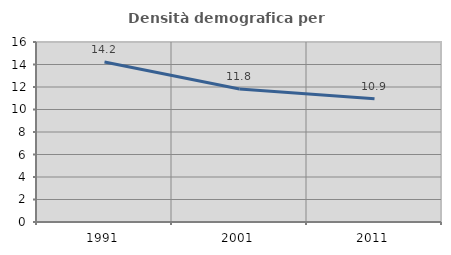
| Category | Densità demografica |
|---|---|
| 1991.0 | 14.224 |
| 2001.0 | 11.822 |
| 2011.0 | 10.95 |